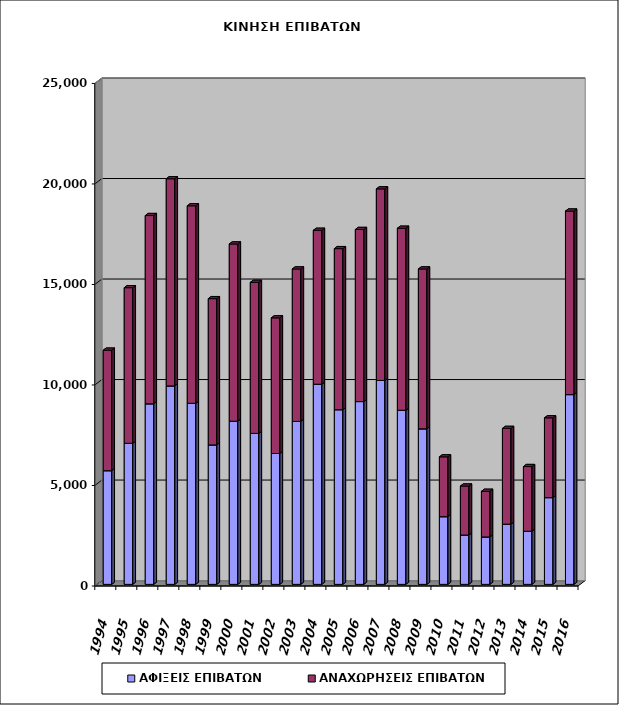
| Category | ΑΦΙΞΕΙΣ ΕΠΙΒΑΤΩΝ | ΑΝΑΧΩΡΗΣΕΙΣ ΕΠΙΒΑΤΩΝ |
|---|---|---|
| 1994.0 | 5655 | 5995 |
| 1995.0 | 7017 | 7741 |
| 1996.0 | 8982 | 9365 |
| 1997.0 | 9872 | 10305 |
| 1998.0 | 9007 | 9825 |
| 1999.0 | 6937 | 7276 |
| 2000.0 | 8116 | 8817 |
| 2001.0 | 7510 | 7515 |
| 2002.0 | 6510 | 6747 |
| 2003.0 | 8107 | 7583 |
| 2004.0 | 9957 | 7656 |
| 2005.0 | 8688 | 8013 |
| 2006.0 | 9093 | 8561 |
| 2007.0 | 10145 | 9528 |
| 2008.0 | 8662 | 9053 |
| 2009.0 | 7737 | 7953 |
| 2010.0 | 3367 | 2976 |
| 2011.0 | 2453 | 2438 |
| 2012.0 | 2358 | 2271 |
| 2013.0 | 2995 | 4763 |
| 2014.0 | 2643 | 3218 |
| 2015.0 | 4315 | 3969 |
| 2016.0 | 9440 | 9130 |